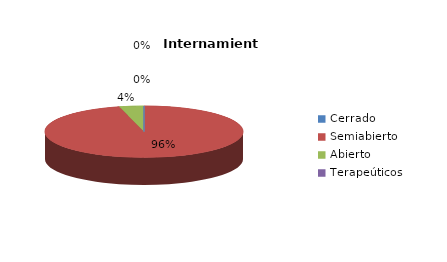
| Category | Series 0 |
|---|---|
| Cerrado | 0 |
| Semiabierto | 24 |
| Abierto | 1 |
| Terapeúticos | 0 |